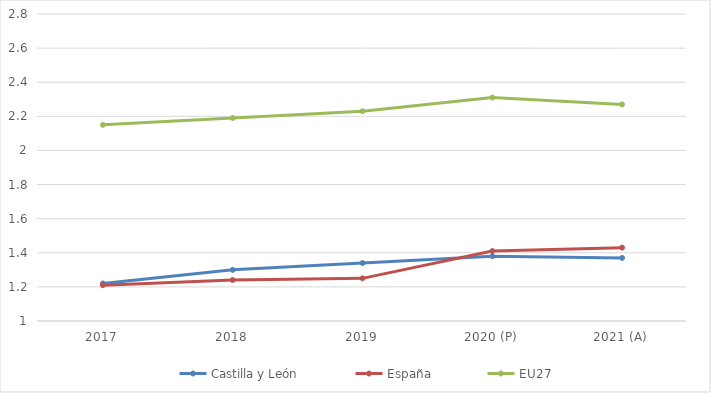
| Category | Castilla y León | España | EU27 |
|---|---|---|---|
| 2017 | 1.22 | 1.21 | 2.15 |
| 2018 | 1.3 | 1.24 | 2.19 |
| 2019 | 1.34 | 1.25 | 2.23 |
| 2020 (P) | 1.38 | 1.41 | 2.31 |
| 2021 (A) | 1.37 | 1.43 | 2.27 |